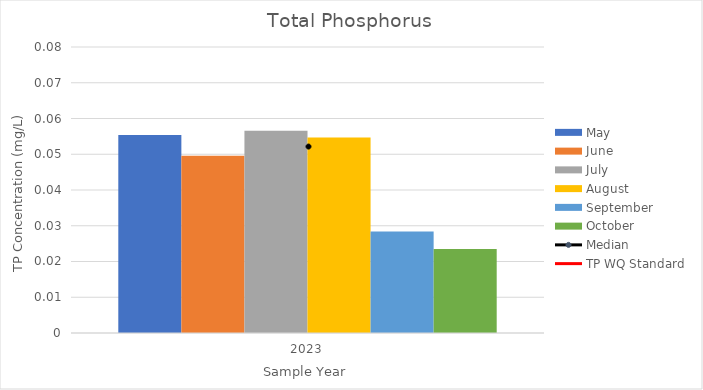
| Category | May | June | July | August | September | October |
|---|---|---|---|---|---|---|
| 2023.0 | 0.055 | 0.05 | 0.057 | 0.055 | 0.028 | 0.024 |